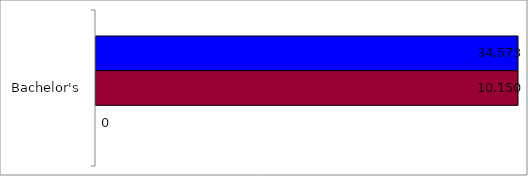
| Category | 50 states and D.C. | SREB states | State |
|---|---|---|---|
| Bachelor's | 34573 | 10150 | 0 |